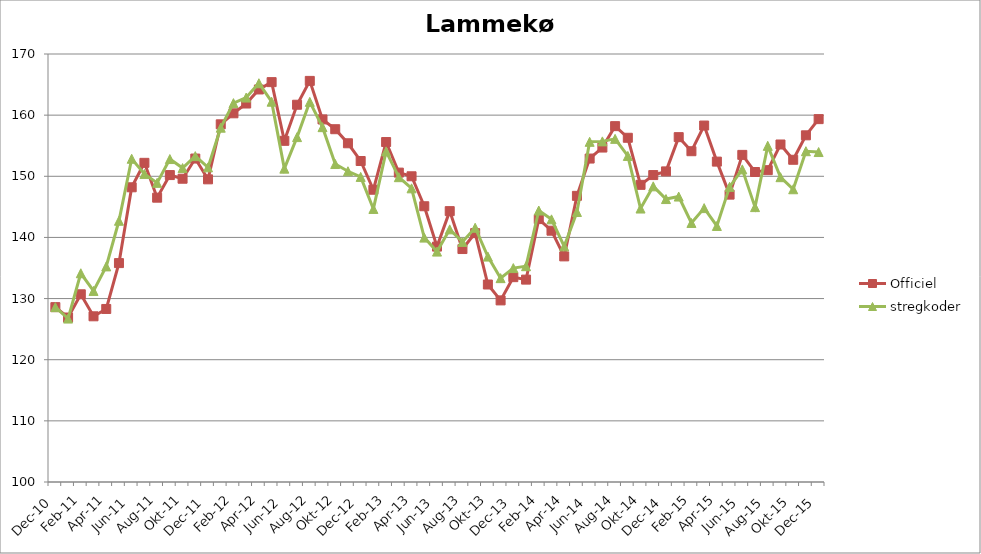
| Category | Officiel | stregkoder |
|---|---|---|
|  Dec-10 | 128.6 | 128.598 |
|  Jan-11 | 126.9 | 126.73 |
|  Feb-11 | 130.7 | 134.14 |
|  Mar-11 | 127.1 | 131.249 |
|  Apr-11 | 128.3 | 135.263 |
|  Maj-11 | 135.8 | 142.724 |
|  Jun-11 | 148.2 | 152.866 |
|  Jul-11 | 152.2 | 150.385 |
|  Aug-11 | 146.5 | 148.924 |
|  Sep-11 | 150.2 | 152.818 |
|  Okt-11 | 149.6 | 151.344 |
|  Nov-11 | 152.9 | 153.296 |
|  Dec-11 | 149.5 | 151.463 |
|  Jan-12 | 158.5 | 157.949 |
|  Feb-12 | 160.3 | 161.965 |
|  Mar-12 | 161.9 | 162.874 |
|  Apr-12 | 164.2 | 165.215 |
|  Maj-12 | 165.4 | 162.2 |
|  Jun-12 | 155.8 | 151.249 |
|  Jul-12 | 161.7 | 156.409 |
|  Aug-12 | 165.6 | 162.172 |
|  Sep-12 | 159.3 | 158.037 |
|  Okt-12 | 157.7 | 152.006 |
|  Nov-12 | 155.4 | 150.824 |
|  Dec-12 | 152.5 | 149.898 |
|  Jan-13 | 147.8 | 144.659 |
|  Feb-13 | 155.6 | 154.074 |
|  Mar-13 | 150.6 | 149.853 |
|  Apr-13 | 150 | 148.028 |
|  Maj-13 | 145.1 | 139.969 |
|  Jun-13 | 138.5 | 137.681 |
|  Jul-13 | 144.3 | 141.32 |
|  Aug-13 | 138.1 | 139.267 |
|  Sep-13 | 140.7 | 141.581 |
|  Okt-13 | 132.3 | 136.868 |
|  Nov-13 | 129.7 | 133.34 |
|  Dec-13 | 133.5 | 134.987 |
|  Jan-14 | 133.1 | 135.296 |
|  Feb-14 | 143 | 144.403 |
|  Mar-14 | 141.1 | 142.957 |
|  Apr-14 | 136.9 | 138.539 |
|  Maj-14 | 146.8 | 144.162 |
|  Jun-14 | 152.9 | 155.637 |
|  Jul-14 | 154.7 | 155.71 |
|  Aug-14 | 158.2 | 156.121 |
|  Sep-14 | 156.3 | 153.327 |
|  Okt-14 | 148.6 | 144.725 |
|  Nov-14 | 150.2 | 148.36 |
|  Dec-14 | 150.8 | 146.277 |
|  Jan-15 | 156.4 | 146.684 |
|  Feb-15 | 154.1 | 142.366 |
|  Mar-15 | 158.3 | 144.796 |
|  Apr-15 | 152.4 | 141.874 |
|  Maj-15 | 147 | 148.269 |
| Jun-15 | 153.5 | 151.131 |
| Jul-15 | 150.7 | 144.959 |
| Aug-15 | 151 | 154.977 |
| Sep-15 | 155.2 | 149.853 |
| Okt-15 | 152.7 | 147.878 |
| Nov-15 | 156.7 | 154.1 |
| Dec-15 | 159.347 | 153.966 |